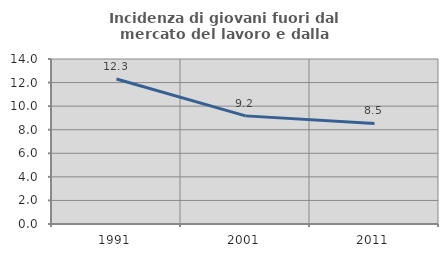
| Category | Incidenza di giovani fuori dal mercato del lavoro e dalla formazione  |
|---|---|
| 1991.0 | 12.308 |
| 2001.0 | 9.174 |
| 2011.0 | 8.537 |